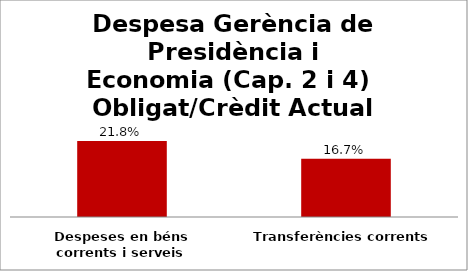
| Category | Series 0 |
|---|---|
| Despeses en béns corrents i serveis | 0.218 |
| Transferències corrents | 0.167 |